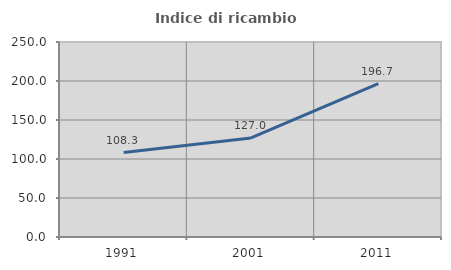
| Category | Indice di ricambio occupazionale  |
|---|---|
| 1991.0 | 108.333 |
| 2001.0 | 127 |
| 2011.0 | 196.667 |